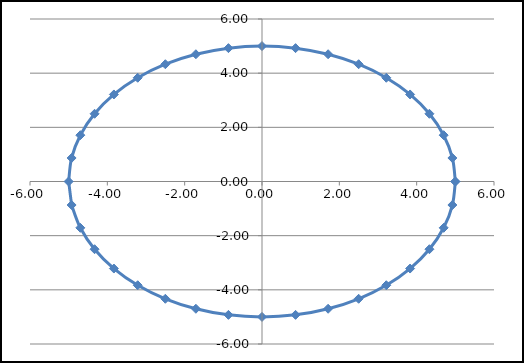
| Category | Series 0 |
|---|---|
| 5.0 | 0 |
| 4.92403876506104 | 0.868 |
| 4.698463103929543 | 1.71 |
| 4.330127018922194 | 2.5 |
| 3.83022221559489 | 3.214 |
| 3.2139380484326967 | 3.83 |
| 2.5000000000000004 | 4.33 |
| 1.7101007166283442 | 4.698 |
| 0.8682408883346521 | 4.924 |
| 3.06287113727155e-16 | 5 |
| -0.8682408883346515 | 4.924 |
| -1.7101007166283435 | 4.698 |
| -2.499999999999999 | 4.33 |
| -3.2139380484326967 | 3.83 |
| -3.8302222155948895 | 3.214 |
| -4.330127018922194 | 2.5 |
| -4.698463103929542 | 1.71 |
| -4.92403876506104 | 0.868 |
| -5.0 | 0 |
| -4.924038765061041 | -0.868 |
| -4.698463103929543 | -1.71 |
| -4.3301270189221945 | -2.5 |
| -3.83022221559489 | -3.214 |
| -3.2139380484326976 | -3.83 |
| -2.500000000000002 | -4.33 |
| -1.7101007166283468 | -4.698 |
| -0.8682408883346516 | -4.924 |
| -9.18861341181465e-16 | -5 |
| 0.8682408883346499 | -4.924 |
| 1.7101007166283408 | -4.698 |
| 2.5000000000000004 | -4.33 |
| 3.2139380484326963 | -3.83 |
| 3.830222215594889 | -3.214 |
| 4.330127018922192 | -2.5 |
| 4.698463103929541 | -1.71 |
| 4.92403876506104 | -0.868 |
| 5.0 | 0 |